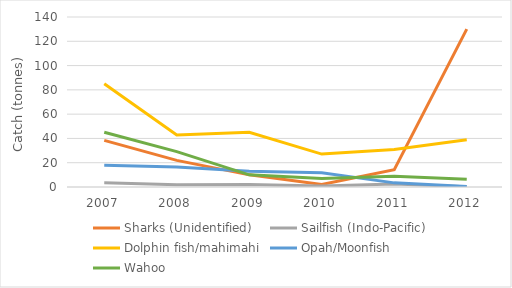
| Category | Sharks (Unidentified) | Sailfish (Indo-Pacific) | Dolphin fish/mahimahi | Opah/Moonfish | Wahoo |
|---|---|---|---|---|---|
| 2007.0 | 38.4 | 3.5 | 85 | 18 | 45.1 |
| 2008.0 | 21.9 | 1.8 | 42.9 | 16.4 | 29.1 |
| 2009.0 | 10 | 2 | 45 | 13 | 10 |
| 2010.0 | 2.1 | 0.8 | 27.1 | 11.8 | 7 |
| 2011.0 | 14.2 | 2.5 | 30.9 | 3.4 | 8.8 |
| 2012.0 | 130 | 0.3 | 39 | 0.5 | 6.3 |